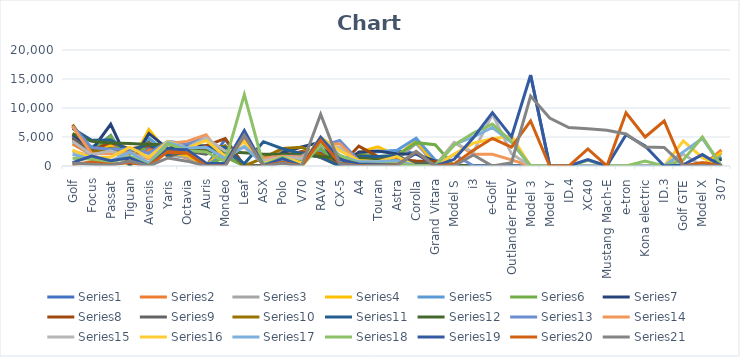
| Category | Series 0 | Series 1 | Series 2 | Series 3 | Series 4 | Series 5 | Series 6 | Series 7 | Series 8 | Series 9 | Series 10 | Series 11 | Series 12 | Series 13 | Series 14 | Series 15 | Series 16 | Series 17 | Series 18 | Series 19 | Series 20 |
|---|---|---|---|---|---|---|---|---|---|---|---|---|---|---|---|---|---|---|---|---|---|
| Golf | 4267 | 3810 | 2598 | 5662 | 5105 | 4190 | 5381 | 4714 | 4885 | 7140 | 6469 | 5570 | 6866 | 6830 | 4277 | 2735 | 2038 | 1328 | 588 | 263 | 461 |
| Focus | 2639 | 1921 | 1688 | 1958 | 3303 | 2419 | 2689 | 2645 | 2155 | 2450 | 4437 | 4261 | 3169 | 2133 | 1964 | 1379 | 1180 | 1164 | 1730 | 682 | 287 |
| Passat | 5255 | 4027 | 3165 | 3501 | 4901 | 5183 | 7194 | 4096 | 3014 | 2987 | 4465 | 3982 | 2899 | 2131 | 2609 | 1525 | 857 | 609 | 903 | 245 | 148 |
| Tiguan | 0 | 0 | 0 | 0 | 0 | 0 | 132 | 2956 | 2440 | 2153 | 2651 | 3879 | 2887 | 2340 | 1446 | 3233 | 2373 | 1662 | 1413 | 594 | 861 |
| Avensis | 3245 | 2800 | 3941 | 6293 | 4831 | 4072 | 5621 | 3519 | 4044 | 3921 | 3764 | 3726 | 2175 | 1200 | 1620 | 1469 | 500 | 143 | 10 | 0 | 0 |
| Yaris | 3066 | 2427 | 1852 | 2228 | 2096 | 2308 | 2938 | 2134 | 1646 | 1821 | 1868 | 3715 | 4250 | 3891 | 4214 | 4247 | 4071 | 3853 | 2889 | 2506 | 1381 |
| Octavia | 1673 | 1380 | 1502 | 1866 | 2341 | 2448 | 3499 | 2278 | 2532 | 3014 | 3291 | 2826 | 3788 | 4247 | 3148 | 3023 | 3123 | 2649 | 2793 | 2246 | 836 |
| Auris | 0 | 0 | 0 | 0 | 0 | 0 | 3470 | 3512 | 2041 | 2877 | 3129 | 2555 | 4818 | 5385 | 4890 | 4419 | 3246 | 2426 | 458 | 0 | 0 |
| Mondeo | 4604 | 3305 | 2796 | 3239 | 2211 | 1558 | 3123 | 4745 | 3466 | 3422 | 3207 | 2445 | 1540 | 931 | 2549 | 1716 | 1281 | 732 | 446 | 96 | 20 |
| Leaf | 0 | 0 | 0 | 0 | 0 | 0 | 0 | 0 | 0 | 0 | 373 | 2298 | 4604 | 4781 | 3189 | 4162 | 3374 | 12303 | 6127 | 5221 | 5313 |
| ASX | 0 | 0 | 0 | 0 | 0 | 0 | 0 | 0 | 0 | 1390 | 4194 | 2028 | 1262 | 1332 | 909 | 414 | 314 | 129 | 42 | 0 | 0 |
| Polo | 1695 | 2657 | 2424 | 1901 | 1875 | 1587 | 2290 | 1653 | 956 | 3032 | 2980 | 2012 | 1647 | 1675 | 1562 | 1482 | 1019 | 1512 | 1292 | 634 | 479 |
| V70 | 1358 | 1358 | 1241 | 1533 | 1180 | 1022 | 3266 | 2513 | 2331 | 3217 | 2128 | 1956 | 1731 | 1569 | 1292 | 510 | 0 | 0 | 0 | 0 | 0 |
| RAV4 | 2218 | 2146 | 2570 | 2610 | 2697 | 3070 | 4117 | 2166 | 1441 | 1928 | 1558 | 1637 | 3395 | 3614 | 3755 | 4955 | 4821 | 3627 | 4977 | 4412 | 8928 |
| CX-5 | 0 | 0 | 0 | 0 | 0 | 0 | 0 | 0 | 0 | 0 | 0 | 1476 | 4387 | 3846 | 3168 | 2655 | 1819 | 1853 | 1116 | 464 | 381 |
| A4 | 2159 | 2232 | 2181 | 2411 | 2369 | 2111 | 2369 | 3436 | 1730 | 1784 | 1693 | 1341 | 898 | 641 | 360 | 930 | 722 | 365 | 347 | 65 | 20 |
| Touran | 0 | 0 | 1054 | 3303 | 2450 | 1617 | 2602 | 1607 | 1240 | 1420 | 1646 | 1085 | 729 | 432 | 338 | 732 | 748 | 359 | 255 | 124 | 72 |
| Astra | 2627 | 1793 | 1057 | 1756 | 2725 | 1801 | 2053 | 1180 | 659 | 1704 | 1775 | 920 | 529 | 464 | 441 | 1620 | 955 | 399 | 181 | 126 | 6 |
| Corolla | 2146 | 4229 | 3886 | 4345 | 4785 | 4024 | 2048 | 843 | 452 | 272 | 206 | 161 | 7 | 0 | 0 | 0 | 0 | 0 | 2213 | 2487 | 2519 |
| Grand Vitara | 121 | 87 | 326 | 556 | 1037 | 3670 | 853 | 784 | 456 | 301 | 223 | 152 | 111 | 58 | 13 | 0 | 0 | 0 | 0 | 0 | 0 |
| Model S | 0 | 0 | 0 | 0 | 0 | 0 | 0 | 0 | 0 | 0 | 0 | 0 | 1983 | 4039 | 4039 | 2051 | 3712 | 3633 | 1149 | 351 | 37 |
| i3 | 0 | 0 | 0 | 0 | 0 | 0 | 0 | 0 | 0 | 0 | 0 | 0 | 51 | 2040 | 2368 | 3943 | 5035 | 5687 | 4851 | 2714 | 1889 |
| e-Golf | 0 | 0 | 0 | 0 | 0 | 0 | 0 | 0 | 0 | 0 | 0 | 0 | 0 | 2018 | 8943 | 4705 | 6639 | 7238 | 9198 | 4770 | 2 |
| Outlander PHEV | 0 | 0 | 0 | 0 | 0 | 0 | 0 | 0 | 0 | 0 | 0 | 0 | 0 | 1047 | 2105 | 5136 | 4067 | 4213 | 5016 | 3257 | 554 |
| Model 3 | 0 | 0 | 0 | 0 | 0 | 0 | 0 | 0 | 0 | 0 | 0 | 0 | 0 | 0 | 0 | 0 | 0 | 0 | 15683 | 7770 | 12058 |
| Model Y | 0 | 0 | 0 | 0 | 0 | 0 | 0 | 0 | 0 | 0 | 0 | 0 | 0 | 0 | 0 | 0 | 0 | 0 | 0 | 0 | 8267 |
| ID.4 | 0 | 0 | 0 | 0 | 0 | 0 | 0 | 0 | 0 | 0 | 0 | 0 | 0 | 0 | 0 | 0 | 0 | 0 | 0 | 0 | 6631 |
| XC40 | 0 | 0 | 0 | 0 | 0 | 0 | 0 | 0 | 0 | 0 | 0 | 0 | 0 | 0 | 0 | 0 | 0 | 994 | 1090 | 2950 | 6415 |
| Mustang Mach-E | 0 | 0 | 0 | 0 | 0 | 0 | 0 | 0 | 0 | 0 | 0 | 0 | 0 | 0 | 0 | 0 | 0 | 0 | 0 | 19 | 6160 |
| e-tron | 0 | 0 | 0 | 0 | 0 | 0 | 0 | 0 | 0 | 0 | 0 | 0 | 0 | 0 | 0 | 0 | 0 | 7 | 5377 | 9184 | 5522 |
| Kona electric | 0 | 0 | 0 | 0 | 0 | 0 | 0 | 0 | 0 | 0 | 0 | 0 | 0 | 0 | 0 | 0 | 0 | 842 | 3451 | 4999 | 3281 |
| ID.3 | 0 | 0 | 0 | 0 | 0 | 0 | 0 | 0 | 0 | 0 | 0 | 0 | 0 | 0 | 0 | 0 | 0 | 0 | 0 | 7754 | 3209 |
| Golf GTE | 0 | 0 | 0 | 0 | 0 | 0 | 0 | 0 | 0 | 0 | 0 | 0 | 0 | 0 | 2029 | 4337 | 2439 | 1061 | 193 | 15 | 81 |
| Model X | 0 | 0 | 0 | 0 | 0 | 0 | 0 | 0 | 0 | 0 | 0 | 0 | 0 | 0 | 0 | 1430 | 4748 | 4981 | 1966 | 616 | 35 |
| 307 | 1392 | 2756 | 2197 | 2345 | 1586 | 1377 | 1169 | 100 | 14 | 0 | 0 | 0 | 0 | 0 | 0 | 0 | 0 | 0 | 0 | 0 | 0 |